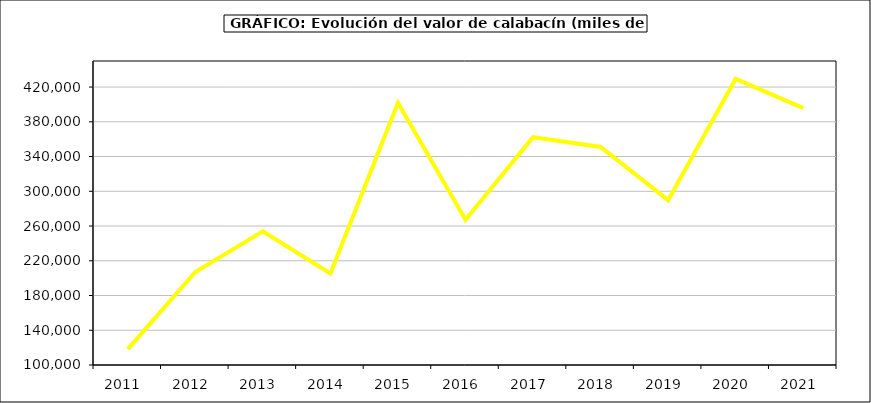
| Category | Valor |
|---|---|
| 2011.0 | 118311.354 |
| 2012.0 | 207035.363 |
| 2013.0 | 253994.073 |
| 2014.0 | 205307.232 |
| 2015.0 | 401801.34 |
| 2016.0 | 267259 |
| 2017.0 | 362286.358 |
| 2018.0 | 351050.64 |
| 2019.0 | 289805.222 |
| 2020.0 | 429498.418 |
| 2021.0 | 395657.96 |